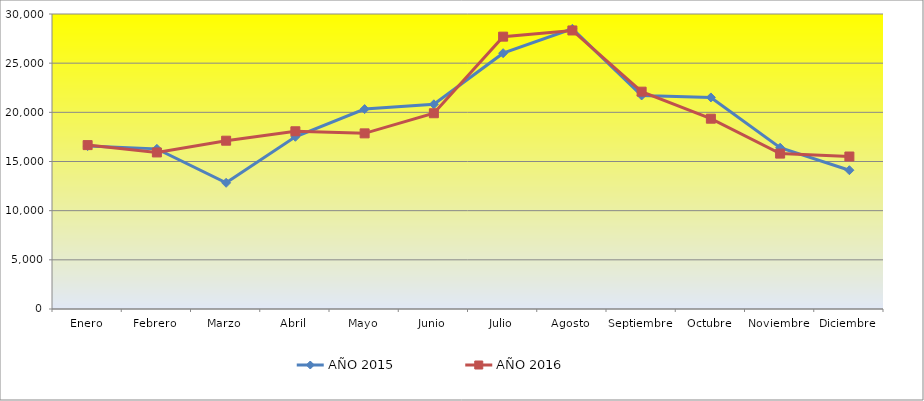
| Category | AÑO 2015 | AÑO 2016 |
|---|---|---|
| Enero | 16568 | 16667 |
| Febrero | 16284 | 15921 |
| Marzo | 12833 | 17115 |
| Abril | 17513 | 18074 |
| Mayo | 20329 | 17861 |
| Junio | 20816 | 19907 |
| Julio | 26015 | 27697 |
| Agosto | 28493 | 28326 |
| Septiembre | 21716 | 22102 |
| Octubre | 21516 | 19353 |
| Noviembre | 16401 | 15804 |
| Diciembre | 14114 | 15506 |